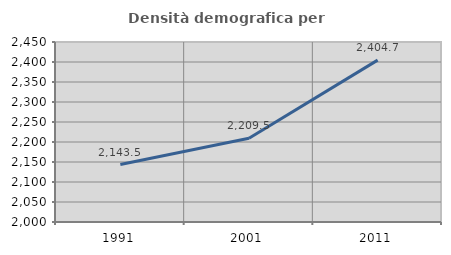
| Category | Densità demografica |
|---|---|
| 1991.0 | 2143.538 |
| 2001.0 | 2209.497 |
| 2011.0 | 2404.659 |